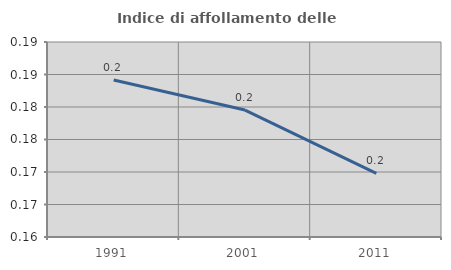
| Category | Indice di affollamento delle abitazioni  |
|---|---|
| 1991.0 | 0.184 |
| 2001.0 | 0.18 |
| 2011.0 | 0.17 |